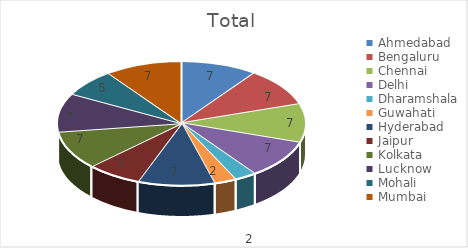
| Category | Total |
|---|---|
| Ahmedabad | 7 |
| Bengaluru | 7 |
| Chennai | 7 |
| Delhi | 7 |
| Dharamshala | 2 |
| Guwahati | 2 |
| Hyderabad | 7 |
| Jaipur | 5 |
| Kolkata | 7 |
| Lucknow | 7 |
| Mohali | 5 |
| Mumbai | 7 |